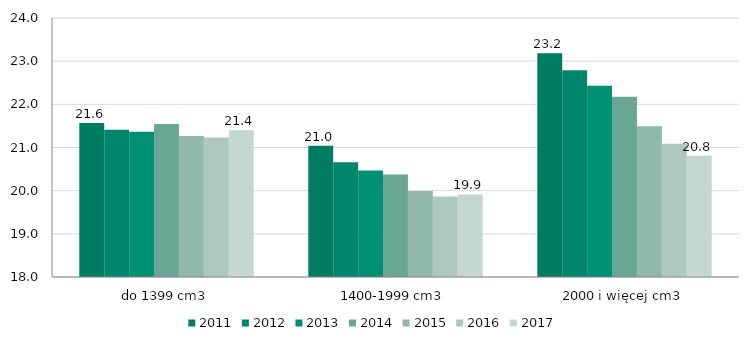
| Category | 2011 | 2012 | 2013 | 2014 | 2015 | 2016 | 2017 |
|---|---|---|---|---|---|---|---|
| do 1399 cm3 | 21.567 | 21.411 | 21.363 | 21.544 | 21.267 | 21.234 | 21.398 |
| 1400-1999 cm3 | 21.042 | 20.66 | 20.467 | 20.372 | 19.993 | 19.863 | 19.914 |
| 2000 i więcej cm3 | 23.186 | 22.791 | 22.431 | 22.176 | 21.494 | 21.088 | 20.808 |